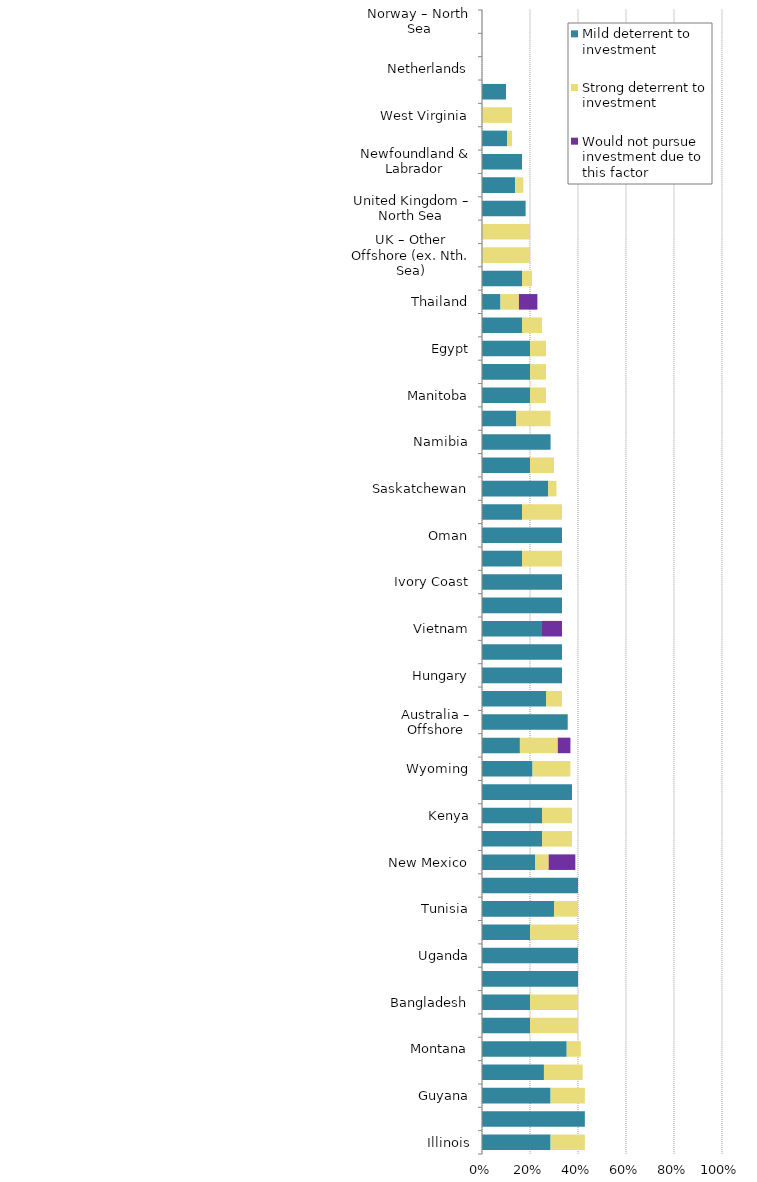
| Category | Mild deterrent to investment | Strong deterrent to investment | Would not pursue investment due to this factor |
|---|---|---|---|
| Illinois | 0.286 | 0.143 | 0 |
| Brunei | 0.429 | 0 | 0 |
| Guyana | 0.286 | 0.143 | 0 |
| Louisiana | 0.258 | 0.161 | 0 |
| Montana | 0.353 | 0.059 | 0 |
| Nova Scotia | 0.2 | 0.2 | 0 |
| Bangladesh | 0.2 | 0.2 | 0 |
| Rep. of Congo (Brazzaville) | 0.4 | 0 | 0 |
| Uganda | 0.4 | 0 | 0 |
| Morocco | 0.2 | 0.2 | 0 |
| Tunisia | 0.3 | 0.1 | 0 |
| Brazil – Onshore CCs | 0.4 | 0 | 0 |
| New Mexico | 0.222 | 0.056 | 0.111 |
| Myanmar | 0.25 | 0.125 | 0 |
| Kenya | 0.25 | 0.125 | 0 |
| Mozambique | 0.375 | 0 | 0 |
| Wyoming | 0.211 | 0.158 | 0 |
| US Offshore – Gulf of Mexico | 0.158 | 0.158 | 0.053 |
| Australia – Offshore | 0.357 | 0 | 0 |
| Kansas | 0.267 | 0.067 | 0 |
| Hungary | 0.333 | 0 | 0 |
| Ireland | 0.333 | 0 | 0 |
| Vietnam | 0.25 | 0 | 0.083 |
| Gabon | 0.333 | 0 | 0 |
| Ivory Coast | 0.333 | 0 | 0 |
| South Africa | 0.167 | 0.167 | 0 |
| Oman | 0.333 | 0 | 0 |
| Suriname | 0.167 | 0.167 | 0 |
| Saskatchewan | 0.276 | 0.034 | 0 |
| Arkansas | 0.2 | 0.1 | 0 |
| Namibia | 0.286 | 0 | 0 |
| Trinidad and Tobago | 0.143 | 0.143 | 0 |
| Manitoba | 0.2 | 0.067 | 0 |
| South Australia | 0.2 | 0.067 | 0 |
| Egypt | 0.2 | 0.067 | 0 |
| New Zealand | 0.167 | 0.083 | 0 |
| Thailand | 0.077 | 0.077 | 0.077 |
| North Dakota | 0.167 | 0.042 | 0 |
| UK – Other Offshore (ex. Nth. Sea) | 0 | 0.2 | 0 |
| Kuwait | 0 | 0.2 | 0 |
| United Kingdom – North Sea | 0.182 | 0 | 0 |
| Oklahoma | 0.138 | 0.034 | 0 |
| Newfoundland & Labrador | 0.167 | 0 | 0 |
| Texas | 0.104 | 0.021 | 0 |
| West Virginia | 0 | 0.125 | 0 |
| United Arab Emirates | 0.1 | 0 | 0 |
| Netherlands | 0 | 0 | 0 |
| Norway – Other Offshore (ex. Nth. Sea) | 0 | 0 | 0 |
| Norway – North Sea | 0 | 0 | 0 |